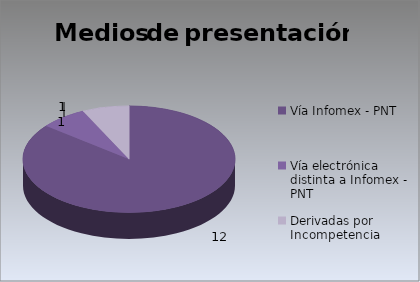
| Category | Series 0 |
|---|---|
| Vía Infomex - PNT | 12 |
| Vía electrónica distinta a Infomex - PNT | 1 |
| Derivadas por Incompetencia | 1 |